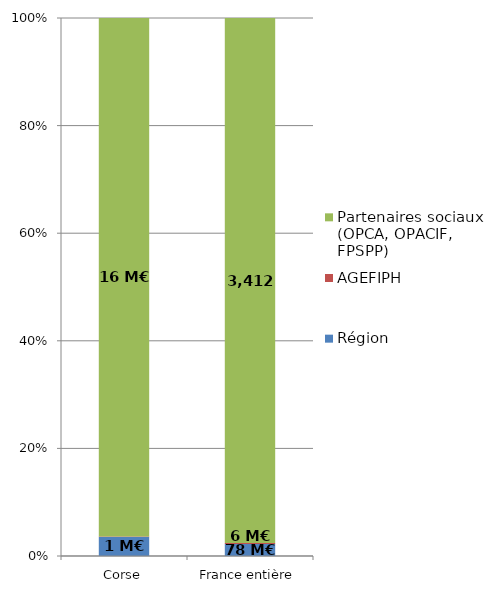
| Category | Région | AGEFIPH | Partenaires sociaux (OPCA, OPACIF, FPSPP) |
|---|---|---|---|
| Corse | 0.585 | 0.01 | 15.867 |
| France entière | 77.612 | 6.161 | 3411.683 |